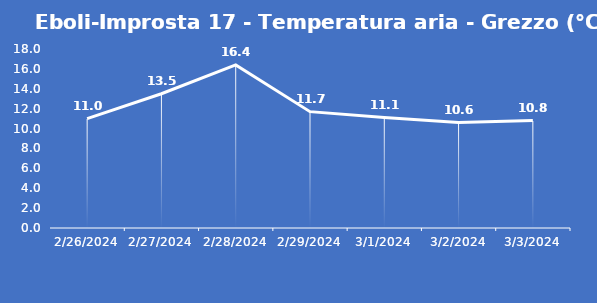
| Category | Eboli-Improsta 17 - Temperatura aria - Grezzo (°C) |
|---|---|
| 2/26/24 | 11 |
| 2/27/24 | 13.5 |
| 2/28/24 | 16.4 |
| 2/29/24 | 11.7 |
| 3/1/24 | 11.1 |
| 3/2/24 | 10.6 |
| 3/3/24 | 10.8 |